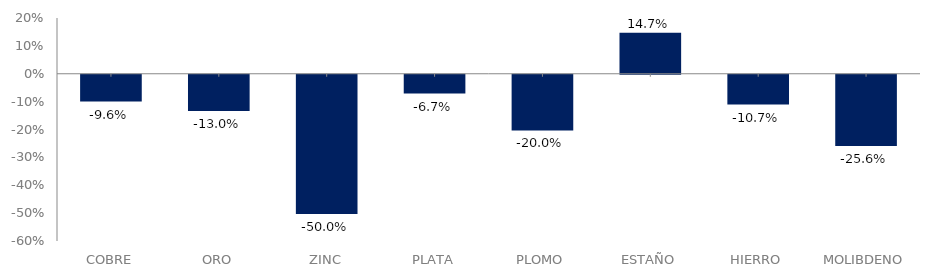
| Category | Series 0 |
|---|---|
| COBRE | -0.096 |
| ORO | -0.13 |
| ZINC | -0.5 |
| PLATA | -0.067 |
| PLOMO | -0.2 |
| ESTAÑO | 0.147 |
| HIERRO | -0.107 |
| MOLIBDENO | -0.256 |